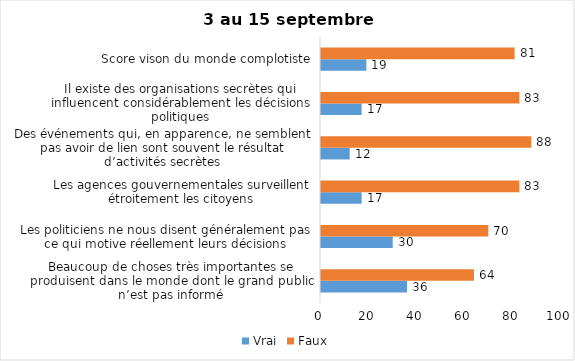
| Category | Vrai | Faux |
|---|---|---|
| Beaucoup de choses très importantes se produisent dans le monde dont le grand public n’est pas informé | 36 | 64 |
| Les politiciens ne nous disent généralement pas ce qui motive réellement leurs décisions | 30 | 70 |
| Les agences gouvernementales surveillent étroitement les citoyens | 17 | 83 |
| Des événements qui, en apparence, ne semblent pas avoir de lien sont souvent le résultat d’activités secrètes | 12 | 88 |
| Il existe des organisations secrètes qui influencent considérablement les décisions politiques | 17 | 83 |
| Score vison du monde complotiste | 19 | 81 |